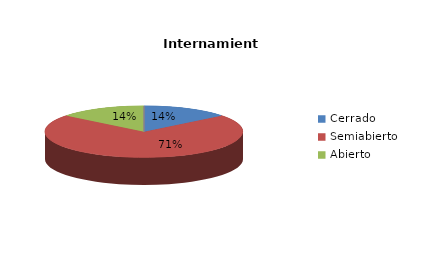
| Category | Series 0 |
|---|---|
| Cerrado | 1 |
| Semiabierto | 5 |
| Abierto | 1 |
| Terapeúticos | 0 |